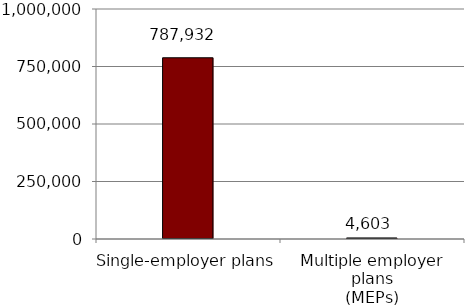
| Category | Series 0 |
|---|---|
| Single-employer plans | 787932 |
| Multiple employer plans
(MEPs) | 4603 |